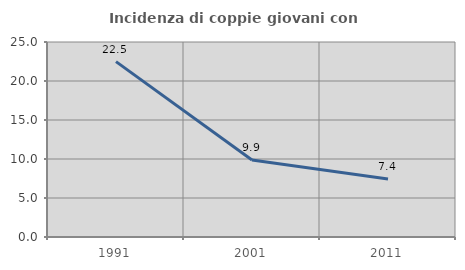
| Category | Incidenza di coppie giovani con figli |
|---|---|
| 1991.0 | 22.488 |
| 2001.0 | 9.865 |
| 2011.0 | 7.426 |